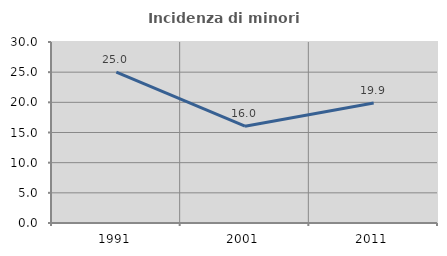
| Category | Incidenza di minori stranieri |
|---|---|
| 1991.0 | 25 |
| 2001.0 | 16.049 |
| 2011.0 | 19.892 |